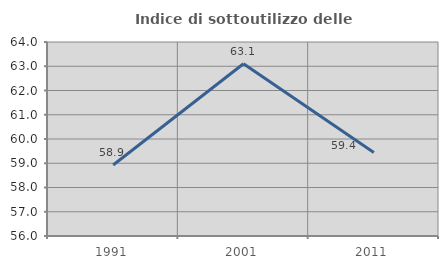
| Category | Indice di sottoutilizzo delle abitazioni  |
|---|---|
| 1991.0 | 58.929 |
| 2001.0 | 63.102 |
| 2011.0 | 59.444 |